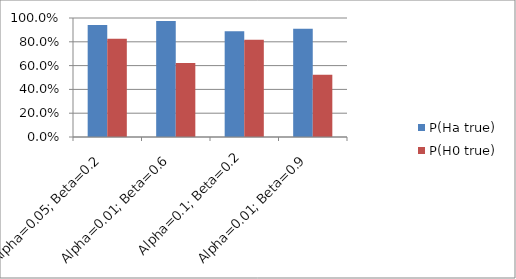
| Category | P(Ha true) | P(H0 true) |
|---|---|---|
| Alpha=0.05; Beta=0.2 | 0.941 | 0.826 |
| Alpha=0.01; Beta=0.6 | 0.976 | 0.623 |
| Alpha=0.1; Beta=0.2 | 0.889 | 0.818 |
| Alpha=0.01; Beta=0.9 | 0.909 | 0.524 |